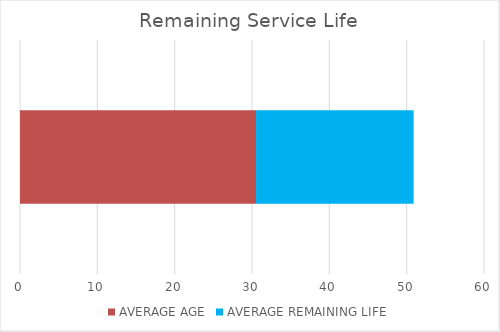
| Category | AVERAGE AGE | AVERAGE REMAINING LIFE |
|---|---|---|
| BACKLOG % OF TOTAL ASSET VALUE | 30.523 | 20.379 |